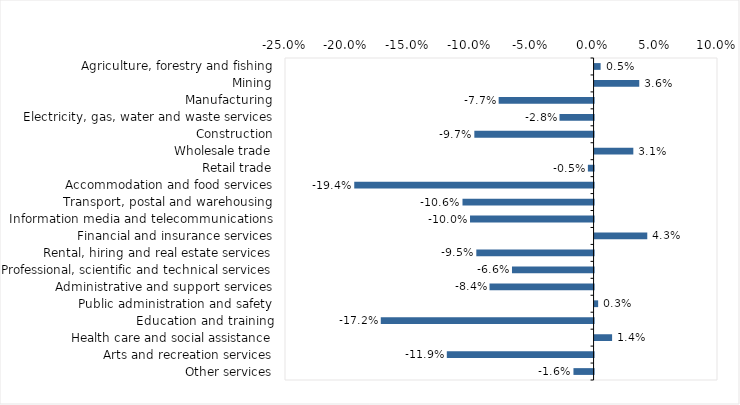
| Category | This week |
|---|---|
| Agriculture, forestry and fishing | 0.005 |
| Mining | 0.036 |
| Manufacturing | -0.077 |
| Electricity, gas, water and waste services | -0.028 |
| Construction | -0.097 |
| Wholesale trade | 0.031 |
| Retail trade | -0.005 |
| Accommodation and food services | -0.194 |
| Transport, postal and warehousing | -0.106 |
| Information media and telecommunications | -0.1 |
| Financial and insurance services | 0.043 |
| Rental, hiring and real estate services | -0.095 |
| Professional, scientific and technical services | -0.066 |
| Administrative and support services | -0.084 |
| Public administration and safety | 0.003 |
| Education and training | -0.172 |
| Health care and social assistance | 0.014 |
| Arts and recreation services | -0.119 |
| Other services | -0.016 |